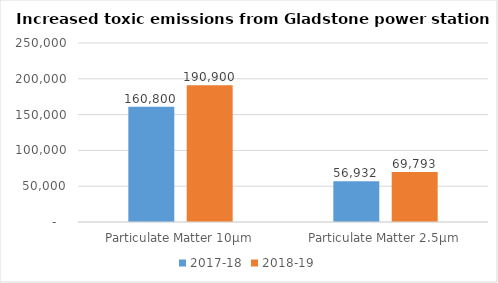
| Category | 2017-18 | 2018-19 |
|---|---|---|
| Particulate Matter 10μm | 160800 | 190900 |
| Particulate Matter 2.5μm | 56932 | 69793.1 |